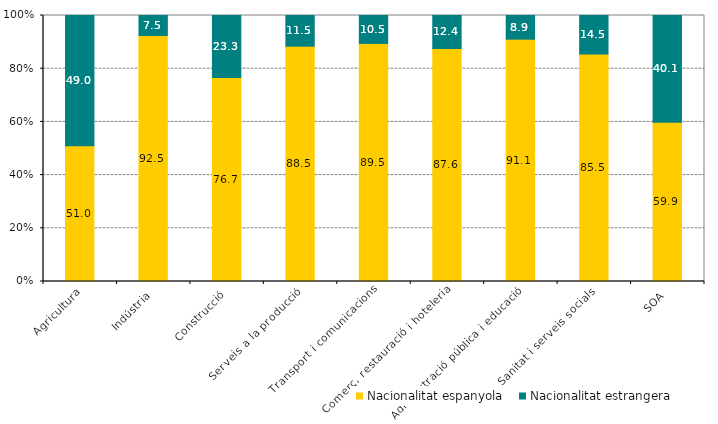
| Category | Nacionalitat espanyola | Nacionalitat estrangera |
|---|---|---|
| Agricultura | 51.046 | 48.954 |
| Indústria | 92.494 | 7.506 |
| Construcció | 76.666 | 23.334 |
| Serveis a la producció | 88.456 | 11.544 |
| Transport i comunicacions | 89.51 | 10.49 |
| Comerç, restauració i hoteleria | 87.632 | 12.368 |
| Administració pública i educació | 91.097 | 8.903 |
| Sanitat i serveis socials | 85.491 | 14.509 |
| SOA | 59.865 | 40.135 |